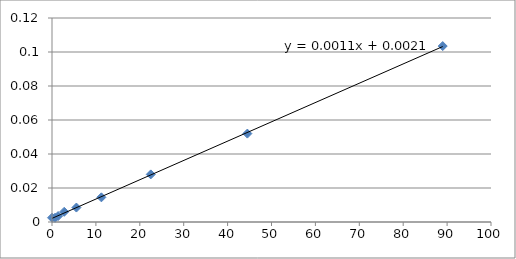
| Category | Series 0 |
|---|---|
| 0.0 | 0.003 |
| 0.69 | 0.003 |
| 1.39 | 0.004 |
| 2.78 | 0.006 |
| 5.56 | 0.008 |
| 11.25 | 0.015 |
| 22.5 | 0.028 |
| 44.5 | 0.052 |
| 89.0 | 0.104 |